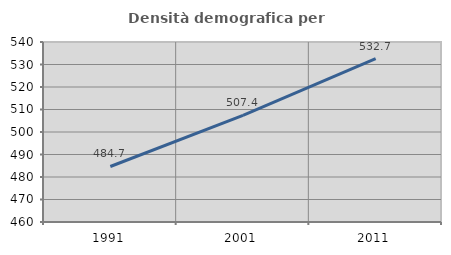
| Category | Densità demografica |
|---|---|
| 1991.0 | 484.677 |
| 2001.0 | 507.401 |
| 2011.0 | 532.664 |